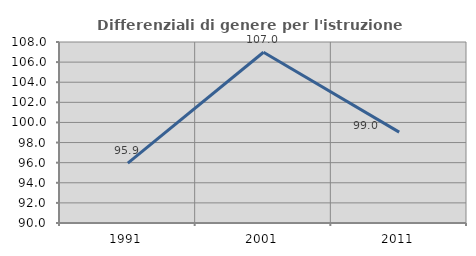
| Category | Differenziali di genere per l'istruzione superiore |
|---|---|
| 1991.0 | 95.946 |
| 2001.0 | 106.984 |
| 2011.0 | 99.038 |